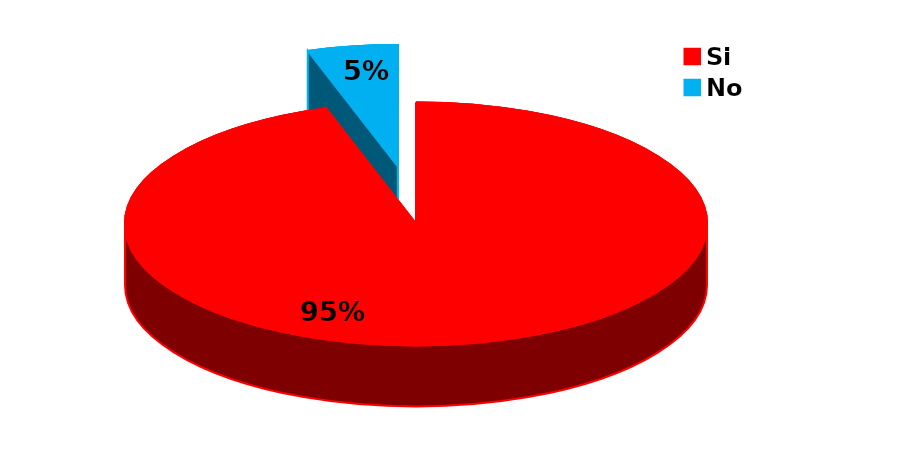
| Category | Series 0 |
|---|---|
| Si | 95 |
| No | 5 |